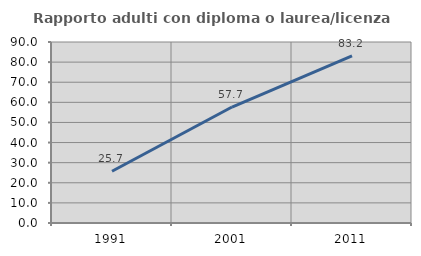
| Category | Rapporto adulti con diploma o laurea/licenza media  |
|---|---|
| 1991.0 | 25.714 |
| 2001.0 | 57.672 |
| 2011.0 | 83.158 |